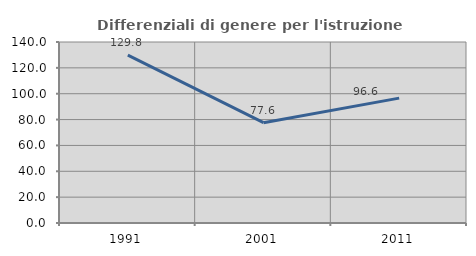
| Category | Differenziali di genere per l'istruzione superiore |
|---|---|
| 1991.0 | 129.809 |
| 2001.0 | 77.59 |
| 2011.0 | 96.596 |